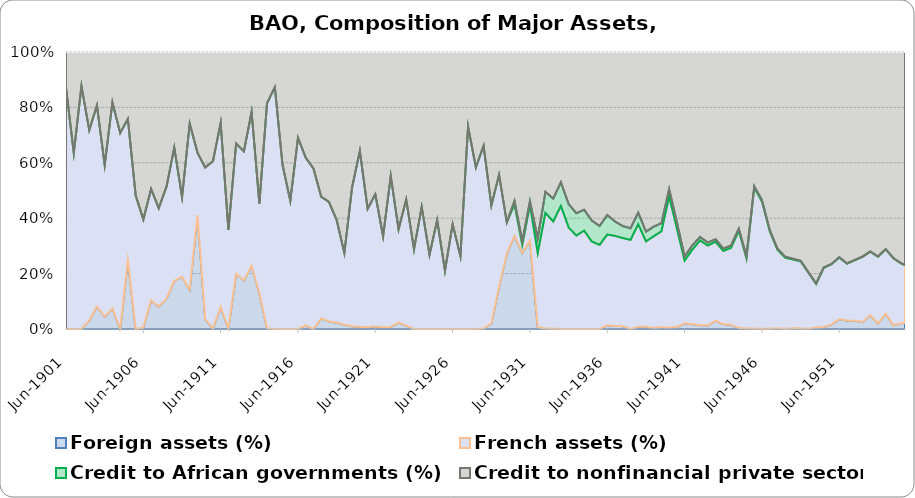
| Category | Foreign assets (%) | French assets (%) | Credit to African governments (%) | Credit to nonfinancial private sector (%) |
|---|---|---|---|---|
| 1901-06-30 | 0 | 0.855 | 0 | 0.127 |
| 1901-12-31 | 0 | 0.626 | 0 | 0.359 |
| 1902-06-30 | 0 | 0.843 | 0 | 0.119 |
| 1902-12-31 | 0.029 | 0.66 | 0 | 0.271 |
| 1903-06-30 | 0.077 | 0.684 | 0 | 0.182 |
| 1903-12-31 | 0.042 | 0.517 | 0 | 0.386 |
| 1904-06-30 | 0.049 | 0.488 | 0 | 0.12 |
| 1904-12-31 | 0 | 0.467 | 0 | 0.193 |
| 1905-06-30 | 0.176 | 0.362 | 0 | 0.172 |
| 1905-12-31 | 0 | 0.327 | 0 | 0.351 |
| 1906-06-30 | 0.004 | 0.282 | 0 | 0.437 |
| 1906-12-31 | 0.074 | 0.284 | 0 | 0.351 |
| 1907-06-30 | 0.059 | 0.259 | 0 | 0.411 |
| 1907-12-31 | 0.081 | 0.3 | 0 | 0.36 |
| 1908-06-30 | 0.129 | 0.357 | 0 | 0.257 |
| 1908-12-31 | 0.137 | 0.209 | 0 | 0.38 |
| 1909-06-30 | 0.111 | 0.471 | 0 | 0.203 |
| 1909-12-31 | 0.336 | 0.184 | 0 | 0.297 |
| 1910-06-30 | 0.028 | 0.445 | 0 | 0.339 |
| 1910-12-31 | 0.002 | 0.492 | 0 | 0.321 |
| 1911-06-30 | 0.065 | 0.542 | 0 | 0.209 |
| 1911-12-31 | 0.001 | 0.278 | 0 | 0.502 |
| 1912-06-30 | 0.159 | 0.375 | 0 | 0.264 |
| 1912-12-31 | 0.139 | 0.368 | 0 | 0.283 |
| 1913-06-30 | 0.185 | 0.449 | 0 | 0.175 |
| 1913-12-31 | 0.104 | 0.262 | 0 | 0.443 |
| 1914-06-30 | 0.002 | 0.675 | 0 | 0.153 |
| 1914-12-31 | 0 | 0.701 | 0 | 0.103 |
| 1915-06-30 | 0 | 0.49 | 0 | 0.336 |
| 1915-12-31 | 0 | 0.391 | 0 | 0.454 |
| 1916-06-30 | 0 | 0.592 | 0 | 0.266 |
| 1916-12-31 | 0.011 | 0.522 | 0 | 0.33 |
| 1917-06-30 | 0 | 0.508 | 0 | 0.369 |
| 1917-12-31 | 0.034 | 0.395 | 0 | 0.47 |
| 1918-06-30 | 0.025 | 0.387 | 0 | 0.485 |
| 1918-12-31 | 0.021 | 0.346 | 0 | 0.568 |
| 1919-06-30 | 0.015 | 0.246 | 0 | 0.69 |
| 1919-12-31 | 0.01 | 0.486 | 0 | 0.471 |
| 1920-06-30 | 0.007 | 0.616 | 0 | 0.348 |
| 1920-12-31 | 0.007 | 0.407 | 0 | 0.54 |
| 1921-06-30 | 0.008 | 0.466 | 0 | 0.5 |
| 1921-12-31 | 0.007 | 0.319 | 0 | 0.65 |
| 1922-06-30 | 0.007 | 0.529 | 0 | 0.436 |
| 1922-12-31 | 0.023 | 0.33 | 0 | 0.628 |
| 1923-06-30 | 0.011 | 0.446 | 0 | 0.521 |
| 1923-12-31 | 0 | 0.283 | 0 | 0.701 |
| 1924-06-30 | 0 | 0.432 | 0 | 0.549 |
| 1924-12-31 | 0 | 0.264 | 0 | 0.722 |
| 1925-06-30 | 0 | 0.386 | 0 | 0.598 |
| 1925-12-31 | 0 | 0.208 | 0 | 0.78 |
| 1926-06-30 | 0 | 0.372 | 0 | 0.612 |
| 1926-12-31 | 0 | 0.259 | 0 | 0.724 |
| 1927-06-30 | 0 | 0.716 | 0 | 0.264 |
| 1927-12-31 | 0 | 0.574 | 0 | 0.41 |
| 1928-06-30 | 0.002 | 0.646 | 0 | 0.332 |
| 1928-12-31 | 0.02 | 0.419 | 0 | 0.545 |
| 1929-06-30 | 0.145 | 0.385 | 0 | 0.423 |
| 1929-12-31 | 0.26 | 0.108 | 0 | 0.589 |
| 1930-06-30 | 0.32 | 0.109 | 0.012 | 0.512 |
| 1930-12-31 | 0.258 | 0.028 | 0.012 | 0.643 |
| 1931-06-30 | 0.299 | 0.12 | 0.013 | 0.504 |
| 1931-12-31 | 0.006 | 0.26 | 0.051 | 0.651 |
| 1932-06-30 | 0.002 | 0.4 | 0.073 | 0.484 |
| 1932-12-31 | 0.001 | 0.369 | 0.079 | 0.504 |
| 1933-06-30 | 0 | 0.423 | 0.081 | 0.448 |
| 1933-12-31 | 0 | 0.346 | 0.08 | 0.52 |
| 1934-06-30 | 0 | 0.322 | 0.077 | 0.556 |
| 1934-12-31 | 0 | 0.341 | 0.072 | 0.546 |
| 1935-06-30 | 0 | 0.305 | 0.073 | 0.588 |
| 1935-12-31 | 0 | 0.293 | 0.066 | 0.605 |
| 1936-06-30 | 0.013 | 0.32 | 0.069 | 0.574 |
| 1936-12-31 | 0.011 | 0.315 | 0.05 | 0.594 |
| 1937-06-30 | 0.01 | 0.308 | 0.042 | 0.61 |
| 1937-12-31 | 0 | 0.315 | 0.041 | 0.623 |
| 1938-06-30 | 0.008 | 0.362 | 0.041 | 0.568 |
| 1938-12-31 | 0.008 | 0.305 | 0.035 | 0.642 |
| 1939-06-30 | 0.004 | 0.325 | 0.034 | 0.621 |
| 1939-12-31 | 0.006 | 0.343 | 0.029 | 0.612 |
| 1940-06-30 | 0.005 | 0.464 | 0.026 | 0.486 |
| 1940-12-31 | 0.007 | 0.344 | 0.022 | 0.597 |
| 1941-06-30 | 0.02 | 0.225 | 0.015 | 0.732 |
| 1941-12-31 | 0.016 | 0.26 | 0.015 | 0.672 |
| 1942-06-30 | 0.013 | 0.296 | 0.012 | 0.648 |
| 1942-12-31 | 0.012 | 0.285 | 0.011 | 0.678 |
| 1943-06-30 | 0.028 | 0.27 | 0.009 | 0.639 |
| 1943-12-31 | 0.017 | 0.251 | 0.008 | 0.674 |
| 1944-06-30 | 0.015 | 0.262 | 0.008 | 0.66 |
| 1944-12-31 | 0.003 | 0.35 | 0.008 | 0.635 |
| 1945-06-30 | 0.002 | 0.24 | 0.007 | 0.701 |
| 1945-12-31 | 0.001 | 0.476 | 0.005 | 0.454 |
| 1946-06-30 | 0.001 | 0.397 | 0.004 | 0.462 |
| 1946-12-31 | 0.001 | 0.31 | 0.004 | 0.567 |
| 1947-06-30 | 0.003 | 0.253 | 0.003 | 0.633 |
| 1947-12-31 | 0.001 | 0.217 | 0.003 | 0.626 |
| 1948-06-30 | 0.002 | 0.213 | 0.003 | 0.641 |
| 1948-12-31 | 0.002 | 0.21 | 0.002 | 0.653 |
| 1949-06-30 | 0.001 | 0.183 | 0.001 | 0.719 |
| 1949-12-31 | 0.005 | 0.14 | 0.001 | 0.745 |
| 1950-06-30 | 0.006 | 0.196 | 0.001 | 0.712 |
| 1950-12-31 | 0.015 | 0.197 | 0.001 | 0.695 |
| 1951-06-30 | 0.033 | 0.209 | 0.001 | 0.693 |
| 1951-12-31 | 0.028 | 0.19 | 0.001 | 0.706 |
| 1952-06-30 | 0.029 | 0.213 | 0.001 | 0.731 |
| 1952-12-31 | 0.024 | 0.229 | 0.001 | 0.717 |
| 1953-06-30 | 0.047 | 0.216 | 0.001 | 0.681 |
| 1953-12-31 | 0.02 | 0.235 | 0.001 | 0.721 |
| 1954-06-30 | 0.052 | 0.219 | 0.001 | 0.671 |
| 1954-12-31 | 0.013 | 0.236 | 0.001 | 0.729 |
| 1955-06-30 | 0.02 | 0.212 | 0.001 | 0.746 |
| 1955-09-30 | 0.021 | 0.203 | 0.001 | 0.747 |